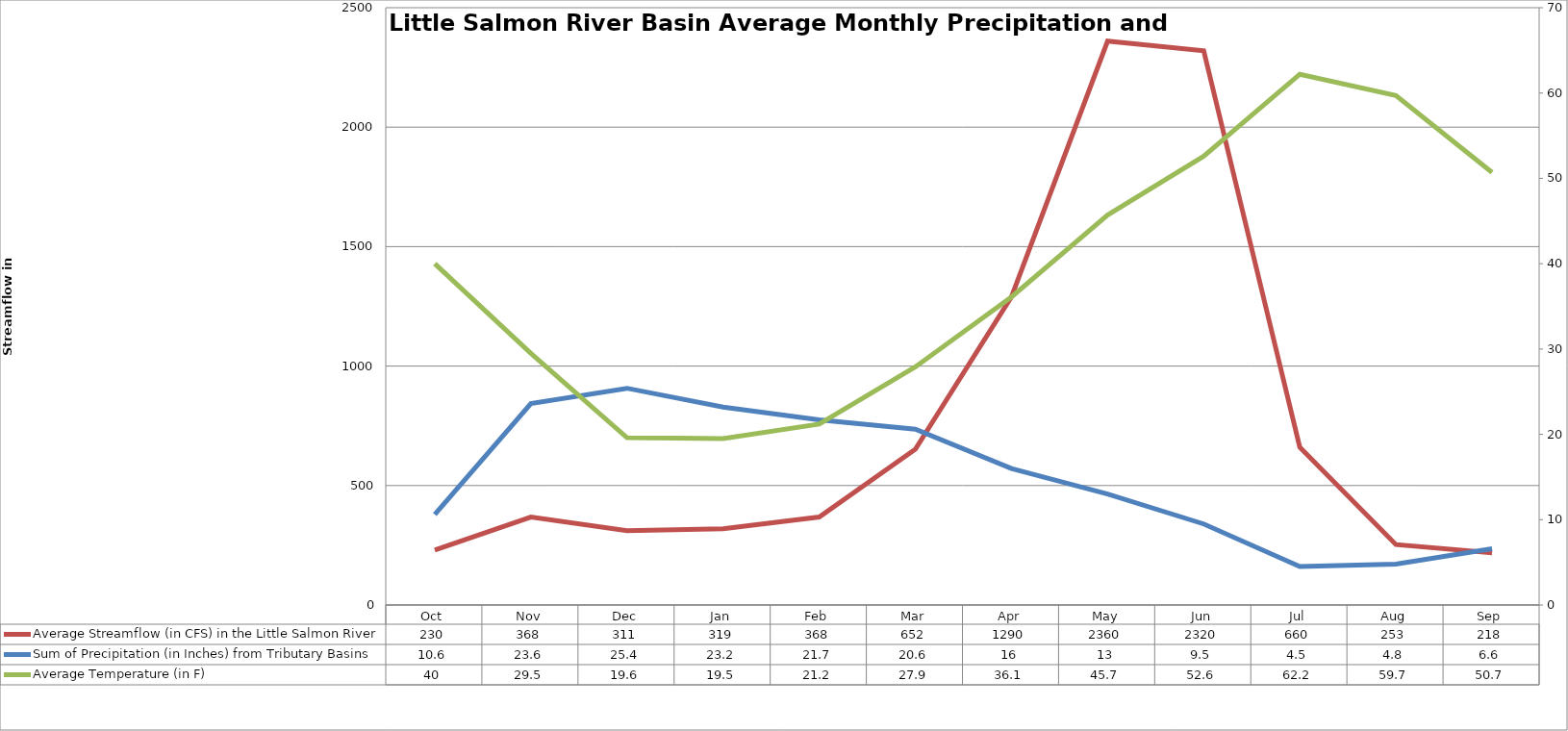
| Category | Average Streamflow (in CFS) in the Little Salmon River |
|---|---|
| Oct | 230 |
| Nov | 368 |
| Dec | 311 |
| Jan | 319 |
| Feb | 368 |
| Mar | 652 |
| Apr | 1290 |
| May | 2360 |
| Jun | 2320 |
| Jul | 660 |
| Aug | 253 |
| Sep | 218 |